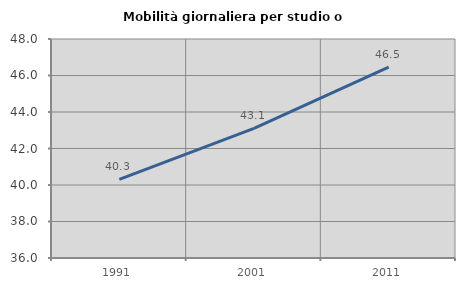
| Category | Mobilità giornaliera per studio o lavoro |
|---|---|
| 1991.0 | 40.312 |
| 2001.0 | 43.099 |
| 2011.0 | 46.456 |